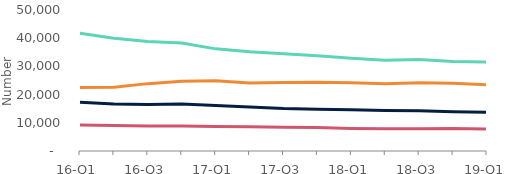
| Category | Arrears of 2.5%-5% of balance | Arrears of 5%-7.5% of balance | Arrears of 7.5%-10% of balance | Arrears over 10% of balance |
|---|---|---|---|---|
| 16-Q1 | 41750 | 17290 | 9260 | 22490 |
| 16-Q2 | 39980 | 16660 | 9040 | 22590 |
| 16-Q3 | 38790 | 16450 | 8880 | 23890 |
| 16-Q4 | 38270 | 16660 | 8860 | 24760 |
| 17-Q1 | 36220 | 16100 | 8730 | 24880 |
| 17-Q2 | 35200 | 15630 | 8600 | 24130 |
| 17-Q3 | 34480 | 15050 | 8420 | 24250 |
| 17-Q4 | 33810 | 14810 | 8290 | 24380 |
| 18-Q1 | 32900 | 14590 | 8000 | 24180 |
| 18-Q2 | 32140 | 14380 | 7870 | 23850 |
| 18-Q3 | 32480 | 14260 | 7880 | 24160 |
| 18-Q4 | 31710 | 13880 | 7970 | 24010 |
| 19-Q1 | 31590 | 13700 | 7770 | 23520 |